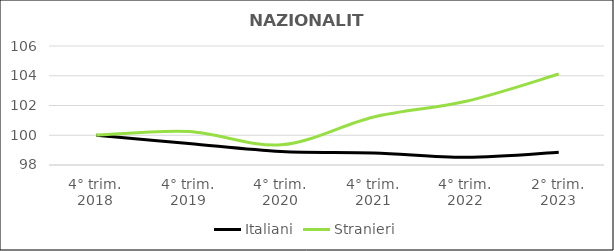
| Category | Italiani | Stranieri |
|---|---|---|
| 4° trim.
2018 | 100 | 100 |
| 4° trim.
2019 | 99.444 | 100.257 |
| 4° trim.
2020 | 98.906 | 99.357 |
| 4° trim.
2021 | 98.811 | 101.229 |
| 4° trim.
2022 | 98.517 | 102.286 |
| 2° trim.
2023 | 98.858 | 104.114 |